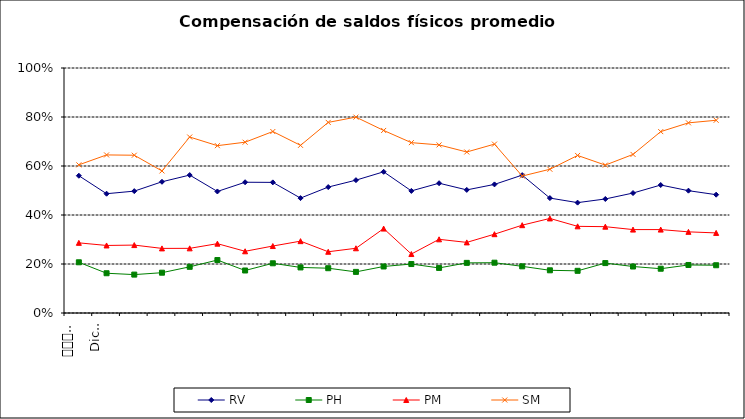
| Category | RV | PH | PM | SM |
|---|---|---|---|---|
| 0 | 0.56 | 0.207 | 0.286 | 0.605 |
| 1 | 0.487 | 0.162 | 0.276 | 0.645 |
| 2 | 0.497 | 0.157 | 0.277 | 0.644 |
| 3 | 0.536 | 0.164 | 0.264 | 0.58 |
| 4 | 0.563 | 0.188 | 0.264 | 0.718 |
| 5 | 0.496 | 0.216 | 0.283 | 0.683 |
| 6 | 0.534 | 0.174 | 0.252 | 0.697 |
| 7 | 0.533 | 0.203 | 0.273 | 0.741 |
| 8 | 0.469 | 0.186 | 0.293 | 0.684 |
| 9 | 0.514 | 0.183 | 0.25 | 0.778 |
| 10 | 0.542 | 0.168 | 0.264 | 0.8 |
| 11 | 0.576 | 0.19 | 0.345 | 0.745 |
| 12 | 0.498 | 0.2 | 0.241 | 0.695 |
| 13 | 0.53 | 0.184 | 0.301 | 0.686 |
| 14 | 0.502 | 0.205 | 0.288 | 0.657 |
| 15 | 0.525 | 0.205 | 0.322 | 0.689 |
| 16 | 0.563 | 0.19 | 0.358 | 0.559 |
| 17 | 0.469 | 0.174 | 0.386 | 0.587 |
| 18 | 0.45 | 0.172 | 0.354 | 0.643 |
| 19 | 0.465 | 0.204 | 0.352 | 0.604 |
| 20 | 0.49 | 0.19 | 0.34 | 0.647 |
| 21 | 0.522 | 0.181 | 0.34 | 0.74 |
| 22 | 0.499 | 0.196 | 0.331 | 0.776 |
| 23 | 0.483 | 0.195 | 0.327 | 0.787 |